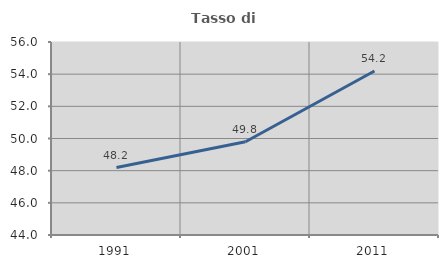
| Category | Tasso di occupazione   |
|---|---|
| 1991.0 | 48.194 |
| 2001.0 | 49.798 |
| 2011.0 | 54.194 |